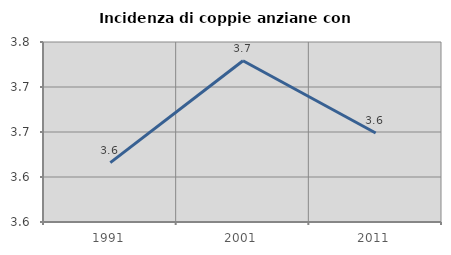
| Category | Incidenza di coppie anziane con figli |
|---|---|
| 1991.0 | 3.616 |
| 2001.0 | 3.729 |
| 2011.0 | 3.649 |